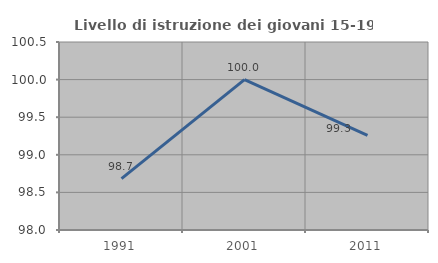
| Category | Livello di istruzione dei giovani 15-19 anni |
|---|---|
| 1991.0 | 98.684 |
| 2001.0 | 100 |
| 2011.0 | 99.259 |